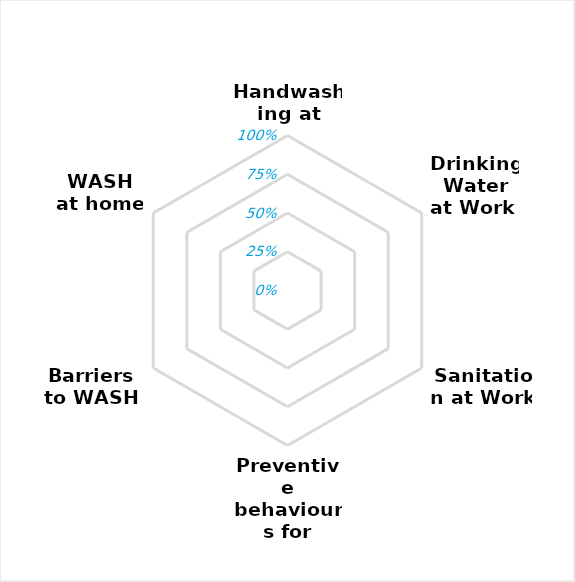
| Category | Series 0 |
|---|---|
| Handwashing at Work | 0 |
| Drinking Water at Work  | 0 |
| Sanitation at Work | 0 |
| Preventive behaviours for COVID19 | 0 |
| Barriers to WASH | 0 |
| WASH at home | 0 |